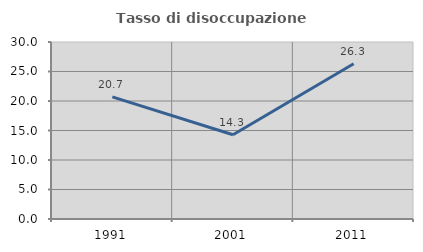
| Category | Tasso di disoccupazione giovanile  |
|---|---|
| 1991.0 | 20.69 |
| 2001.0 | 14.286 |
| 2011.0 | 26.316 |